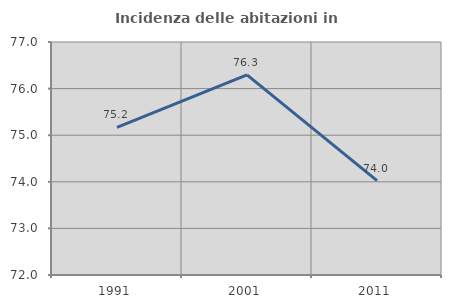
| Category | Incidenza delle abitazioni in proprietà  |
|---|---|
| 1991.0 | 75.169 |
| 2001.0 | 76.295 |
| 2011.0 | 74.026 |